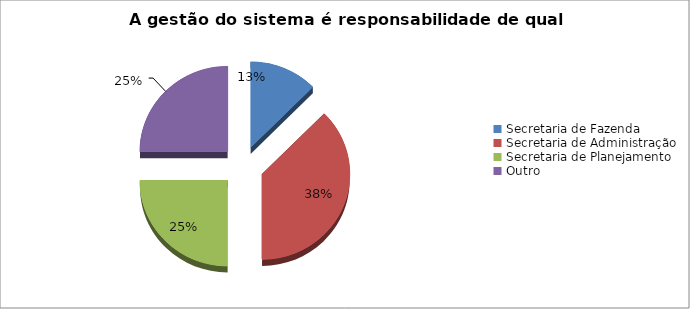
| Category | Series 0 |
|---|---|
| Secretaria de Fazenda | 0.125 |
| Secretaria de Administração  | 0.375 |
| Secretaria de Planejamento | 0.25 |
| Outro | 0.25 |